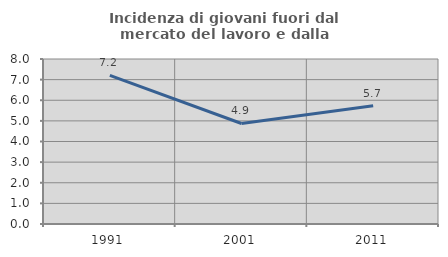
| Category | Incidenza di giovani fuori dal mercato del lavoro e dalla formazione  |
|---|---|
| 1991.0 | 7.207 |
| 2001.0 | 4.874 |
| 2011.0 | 5.732 |